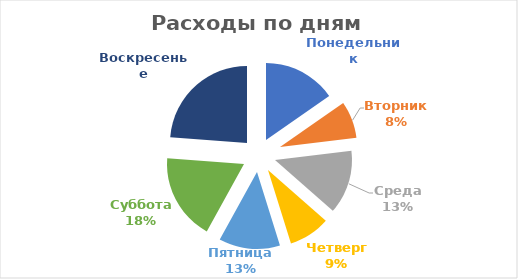
| Category | Расходы по дням недели |
|---|---|
| Понедельник | 81 |
| Вторник | 41 |
| Среда | 71 |
| Четверг | 46 |
| Пятница | 68 |
| Суббота | 96 |
| Воскресенье | 126 |